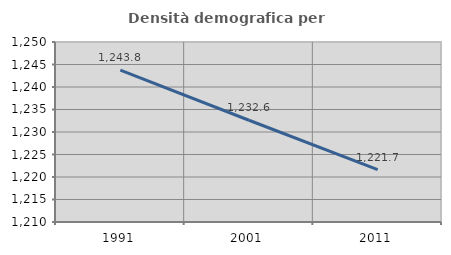
| Category | Densità demografica |
|---|---|
| 1991.0 | 1243.761 |
| 2001.0 | 1232.611 |
| 2011.0 | 1221.654 |